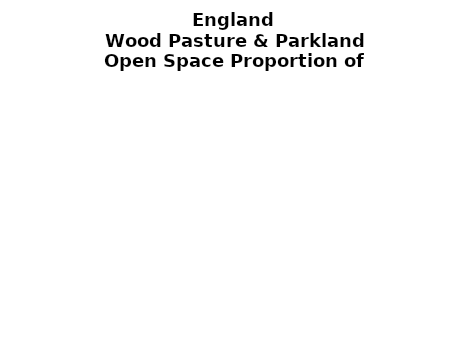
| Category | Wood Pasture & Parkland |
|---|---|
|  ≥ 10ha, < 10%  | 0.236 |
|   ≥ 10ha, 10-25% | 0.063 |
|   ≥ 10ha, > 25 and <50%  | 0.088 |
|   ≥ 10ha, ≥ 50%  | 0.232 |
|  < 10ha, < 10% | 0 |
|  < 10ha, 10-25% | 0.017 |
|  < 10ha, > 25 and < 50% | 0.04 |
|  < 10ha, ≥ 50% | 0.325 |